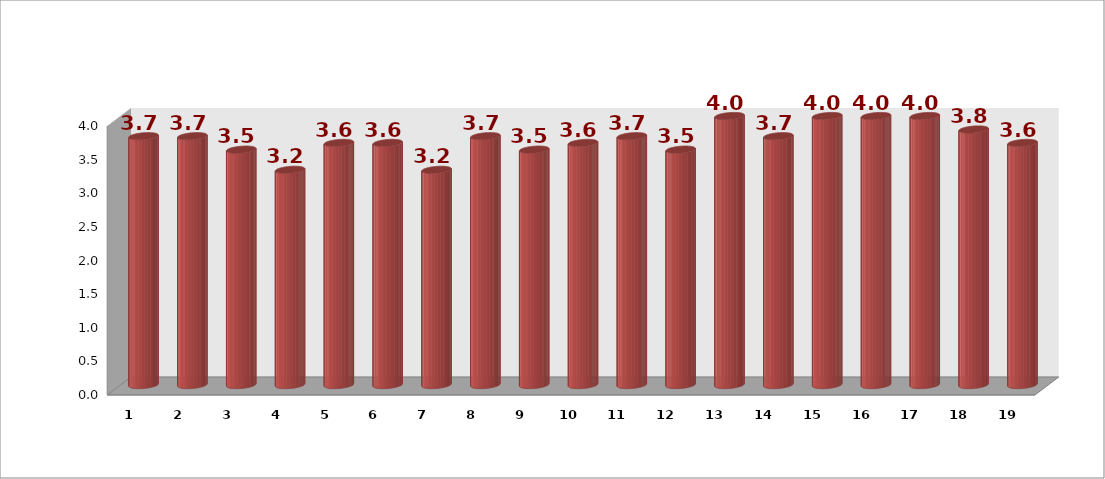
| Category | Series 1 |
|---|---|
| 0 | 3.7 |
| 1 | 3.7 |
| 2 | 3.5 |
| 3 | 3.2 |
| 4 | 3.6 |
| 5 | 3.6 |
| 6 | 3.2 |
| 7 | 3.7 |
| 8 | 3.5 |
| 9 | 3.6 |
| 10 | 3.7 |
| 11 | 3.5 |
| 12 | 4 |
| 13 | 3.7 |
| 14 | 4 |
| 15 | 4 |
| 16 | 4 |
| 17 | 3.8 |
| 18 | 3.6 |